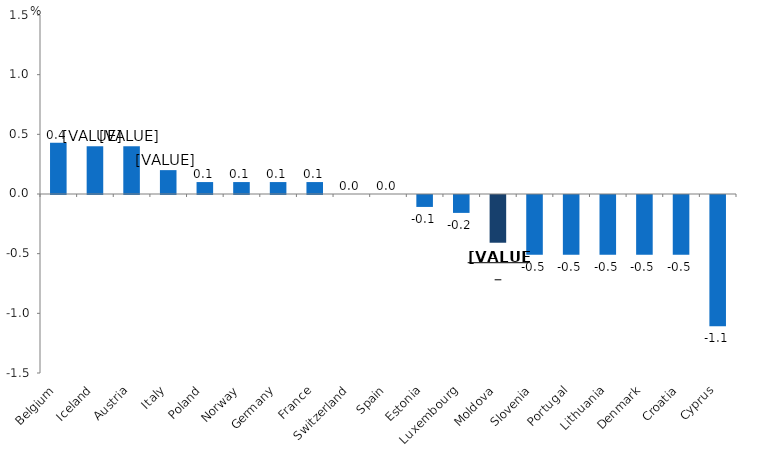
| Category | Series 0 |
|---|---|
| Belgium | 0.43 |
| Iceland | 0.4 |
| Austria | 0.4 |
| Italy | 0.2 |
| Poland | 0.1 |
| Norway | 0.1 |
| Germany | 0.1 |
| France | 0.1 |
| Switzerland | 0 |
| Spain | 0 |
| Estonia | -0.1 |
| Luxembourg | -0.15 |
| Moldova | -0.4 |
| Slovenia | -0.5 |
| Portugal | -0.5 |
| Lithuania | -0.5 |
| Denmark | -0.5 |
| Croatia | -0.5 |
| Cyprus | -1.1 |